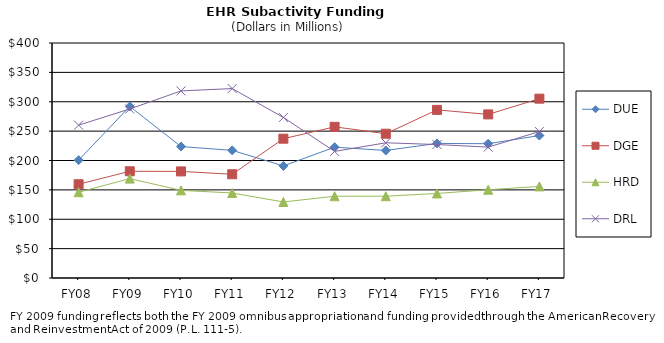
| Category | DUE | DGE | HRD | DRL |
|---|---|---|---|---|
| FY08 | 200.56 | 159.59 | 145.94 | 260.17 |
| FY09 | 291.99 | 181.67 | 169.18 | 287.67 |
| FY10 | 223.75 | 181.43 | 149.16 | 318.42 |
| FY11 | 217.28 | 176.58 | 144.71 | 322.47 |
| FY12 | 190.79 | 237.11 | 129.41 | 273.23 |
| FY13 | 222.68 | 257.31 | 139.18 | 215.45 |
| FY14 | 217.1 | 245.58 | 139.21 | 230.13 |
| FY15 | 229.079 | 286.144 | 143.904 | 227.204 |
| FY16 | 228.54 | 278.48 | 150.23 | 222.75 |
| FY17 | 242.43 | 305.26 | 155.89 | 249.28 |